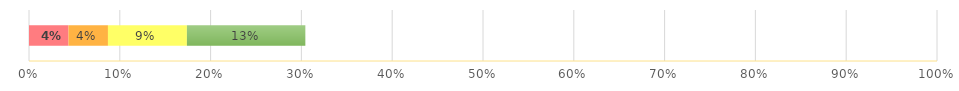
| Category | Series 0 | Series 1 | Series 2 | Series 3 |
|---|---|---|---|---|
| 0 | 0.043 | 0.043 | 0.087 | 0.13 |